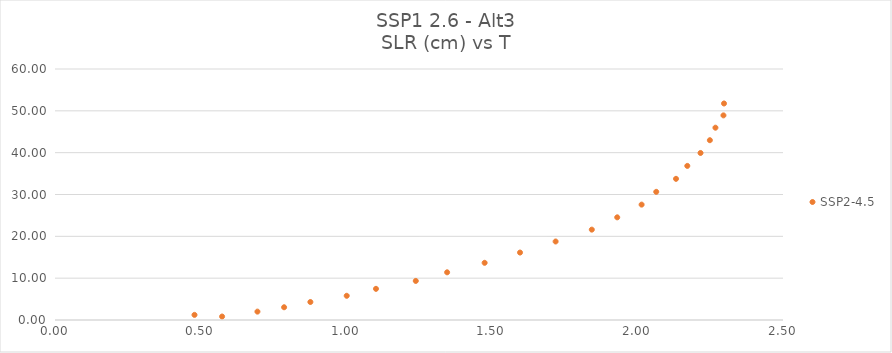
| Category | SSP2-4.5 |
|---|---|
| 0.573801925 | 0.83 |
| 0.479031654 | 1.225 |
| 0.695197934 | 2.004 |
| 0.786748548 | 3.047 |
| 0.877021499 | 4.302 |
| 1.001775485 | 5.786 |
| 1.102283052 | 7.449 |
| 1.238965881 | 9.339 |
| 1.346554915 | 11.401 |
| 1.475402007 | 13.668 |
| 1.59693456 | 16.123 |
| 1.719191477 | 18.767 |
| 1.843408768 | 21.6 |
| 1.930718807 | 24.542 |
| 2.014503307 | 27.58 |
| 2.064698628 | 30.637 |
| 2.132590274 | 33.745 |
| 2.171375019 | 36.838 |
| 2.216782589 | 39.927 |
| 2.248851666 | 42.981 |
| 2.268002815 | 45.97 |
| 2.295499248 | 48.914 |
| 2.297430907 | 51.756 |